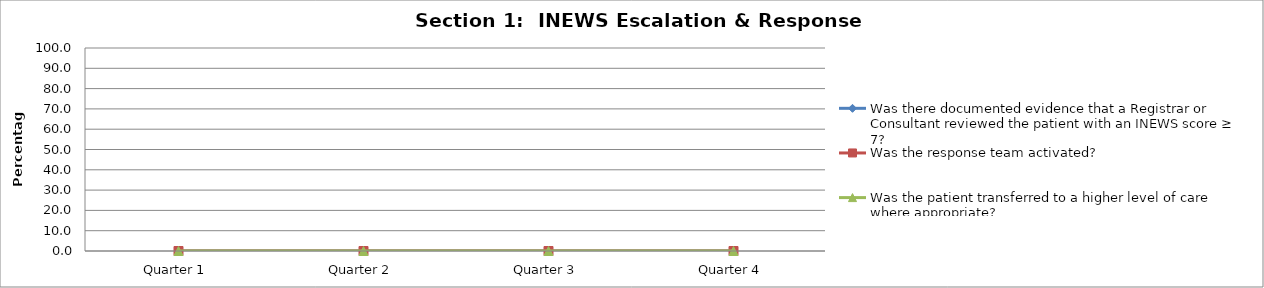
| Category | Was there documented evidence that a Registrar or Consultant reviewed the patient with an INEWS score ≥ 7? | Was the response team activated? | Was the patient transferred to a higher level of care where appropriate? |
|---|---|---|---|
| Quarter 1 | 0 | 0 | 0 |
| Quarter 2 | 0 | 0 | 0 |
| Quarter 3 | 0 | 0 | 0 |
| Quarter 4 | 0 | 0 | 0 |